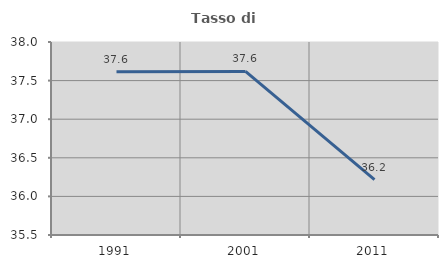
| Category | Tasso di occupazione   |
|---|---|
| 1991.0 | 37.615 |
| 2001.0 | 37.619 |
| 2011.0 | 36.216 |